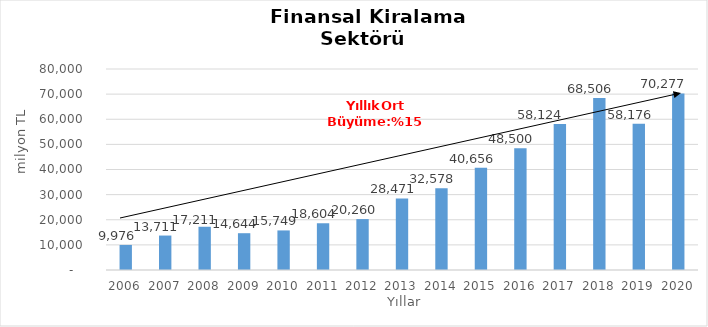
| Category | Finansal Kiralama  |
|---|---|
| 2006.0 | 9976.07 |
| 2007.0 | 13710.562 |
| 2008.0 | 17210.614 |
| 2009.0 | 14644.05 |
| 2010.0 | 15748.853 |
| 2011.0 | 18604.083 |
| 2012.0 | 20259.96 |
| 2013.0 | 28470.82 |
| 2014.0 | 32578 |
| 2015.0 | 40656 |
| 2016.0 | 48500 |
| 2017.0 | 58124 |
| 2018.0 | 68506 |
| 2019.0 | 58176 |
| 2020.0 | 70277 |